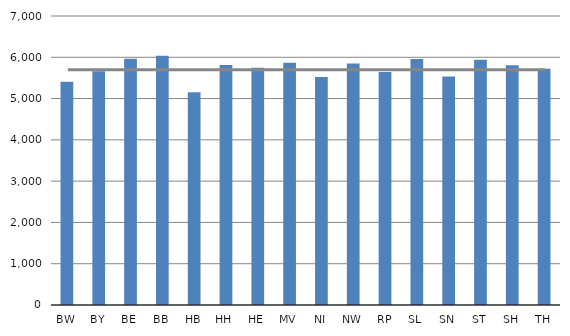
| Category | Summe von € je Einwohner |
|---|---|
| BW | 5408 |
| BY | 5660 |
| BE | 5965 |
| BB | 6036 |
| HB | 5156 |
| HH | 5814 |
| HE | 5747 |
| MV | 5870 |
| NI | 5521 |
| NW | 5848 |
| RP | 5646 |
| SL | 5959 |
| SN | 5532 |
| ST | 5943 |
| SH | 5807 |
| TH | 5720 |